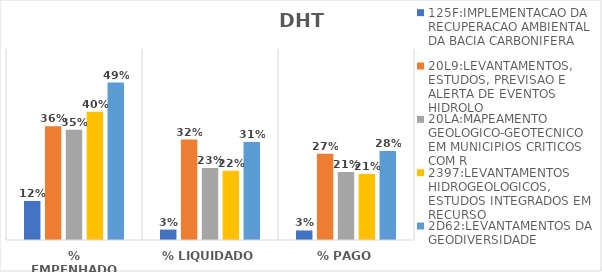
| Category | 125F:IMPLEMENTACAO DA RECUPERACAO AMBIENTAL DA BACIA CARBONIFERA | 20L9:LEVANTAMENTOS, ESTUDOS, PREVISAO E ALERTA DE EVENTOS HIDROLO | 20LA:MAPEAMENTO GEOLOGICO-GEOTECNICO EM MUNICIPIOS CRITICOS COM R | 2397:LEVANTAMENTOS HIDROGEOLOGICOS, ESTUDOS INTEGRADOS EM RECURSO | 2D62:LEVANTAMENTOS DA GEODIVERSIDADE |
|---|---|---|---|---|---|
| % EMPENHADO | 0.123 | 0.357 | 0.346 | 0.403 | 0.495 |
| % LIQUIDADO | 0.033 | 0.316 | 0.226 | 0.218 | 0.308 |
| % PAGO | 0.03 | 0.271 | 0.214 | 0.207 | 0.28 |